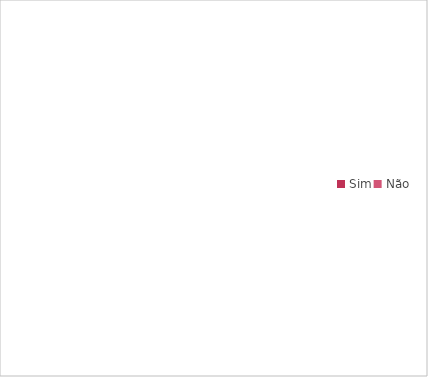
| Category | Series 0 |
|---|---|
| Sim | 0 |
| Não | 0 |